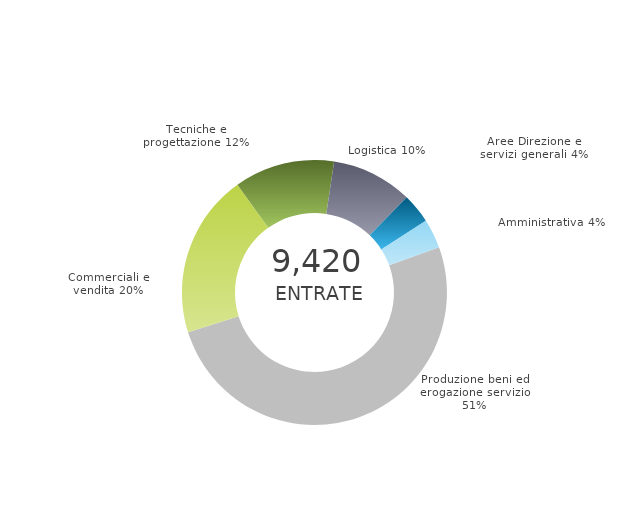
| Category | Series 0 | Series 1 |
|---|---|---|
| Produzione beni ed erogazione servizio | 0 | 0.507 |
| Commerciali e vendita | 0 | 0.2 |
| Tecniche e progettazione | 0 | 0.122 |
| Logistica | 0 | 0.099 |
| Aree Direzione e servizi generali | 0 | 0.036 |
| Amministrativa | 0 | 0.036 |